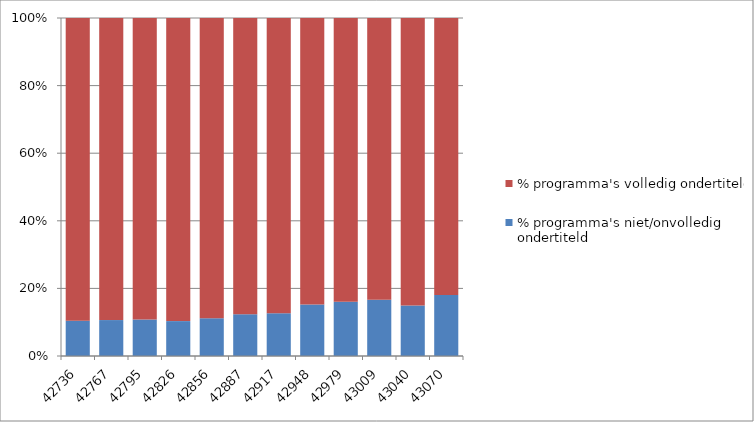
| Category | % programma's niet/onvolledig ondertiteld | % programma's volledig ondertiteld |
|---|---|---|
| 42736.0 | 0.105 | 0.895 |
| 42767.0 | 0.106 | 0.894 |
| 42795.0 | 0.108 | 0.892 |
| 42826.0 | 0.103 | 0.897 |
| 42856.0 | 0.112 | 0.888 |
| 42887.0 | 0.124 | 0.876 |
| 42917.0 | 0.127 | 0.873 |
| 42948.0 | 0.152 | 0.848 |
| 42979.0 | 0.16 | 0.84 |
| 43009.0 | 0.166 | 0.834 |
| 43040.0 | 0.149 | 0.851 |
| 43070.0 | 0.18 | 0.82 |